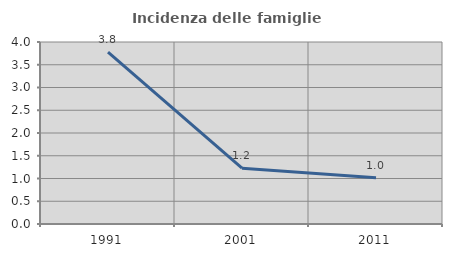
| Category | Incidenza delle famiglie numerose |
|---|---|
| 1991.0 | 3.776 |
| 2001.0 | 1.226 |
| 2011.0 | 1.015 |